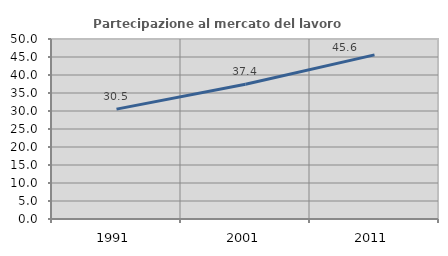
| Category | Partecipazione al mercato del lavoro  femminile |
|---|---|
| 1991.0 | 30.522 |
| 2001.0 | 37.418 |
| 2011.0 | 45.593 |